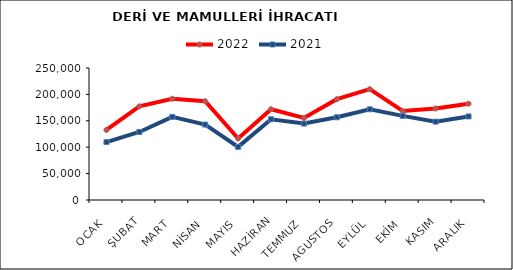
| Category | 2022 | 2021 |
|---|---|---|
| OCAK | 132688.504 | 109745.779 |
| ŞUBAT | 177392.943 | 128849.98 |
| MART | 191705.159 | 157415.669 |
| NİSAN | 187035.604 | 142850.457 |
| MAYIS | 116468.307 | 100608.109 |
| HAZİRAN | 171948.242 | 152945.257 |
| TEMMUZ | 155381.607 | 144731.094 |
| AGUSTOS | 190918.488 | 156640.95 |
| EYLÜL | 209908.259 | 171821.913 |
| EKİM | 168528.697 | 159286.074 |
| KASIM | 173351.059 | 148391.046 |
| ARALIK | 182430.395 | 158218.043 |